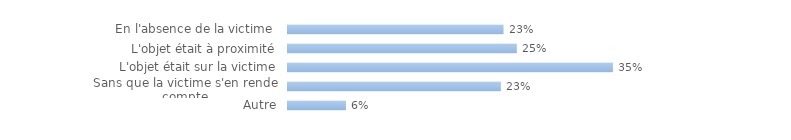
| Category | Series 0 |
|---|---|
| En l'absence de la victime  | 0.233 |
| L'objet était à proximité | 0.247 |
| L'objet était sur la victime | 0.351 |
| Sans que la victime s'en rende compte | 0.23 |
| Autre | 0.063 |